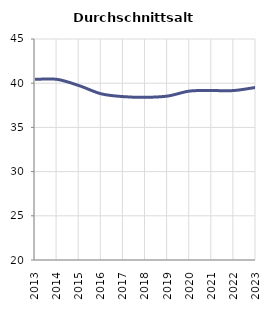
| Category | Durchschnittsalter |
|---|---|
| 2013.0 | 40.432 |
| 2014.0 | 40.434 |
| 2015.0 | 39.719 |
| 2016.0 | 38.796 |
| 2017.0 | 38.481 |
| 2018.0 | 38.405 |
| 2019.0 | 38.544 |
| 2020.0 | 39.11 |
| 2021.0 | 39.167 |
| 2022.0 | 39.17 |
| 2023.0 | 39.529 |